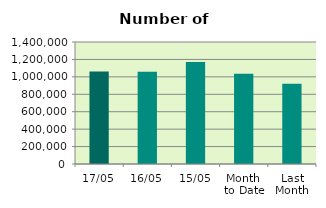
| Category | Series 0 |
|---|---|
| 17/05 | 1062756 |
| 16/05 | 1058026 |
| 15/05 | 1169152 |
| Month 
to Date | 1035471.167 |
| Last
Month | 921109.3 |